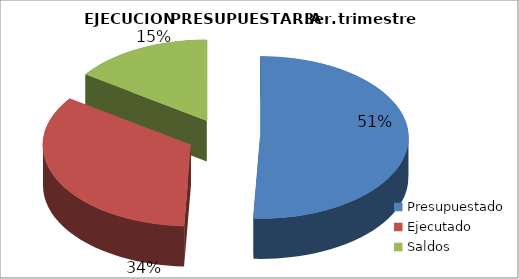
| Category | Series 0 |
|---|---|
| Presupuestado | 76780119311 |
| Ejecutado | 51394393410 |
| Saldos | 23160116886 |